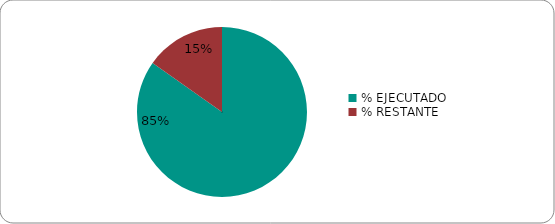
| Category | Series 0 |
|---|---|
| % EJECUTADO | 0.848 |
| % RESTANTE | 0.152 |